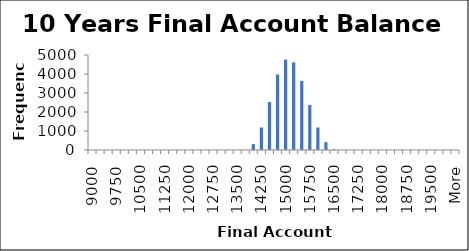
| Category | Frequency |
|---|---|
| 9000.0 | 0 |
| 9250.0 | 0 |
| 9500.0 | 0 |
| 9750.0 | 0 |
| 10000.0 | 0 |
| 10250.0 | 0 |
| 10500.0 | 0 |
| 10750.0 | 0 |
| 11000.0 | 0 |
| 11250.0 | 0 |
| 11500.0 | 0 |
| 11750.0 | 0 |
| 12000.0 | 0 |
| 12250.0 | 0 |
| 12500.0 | 0 |
| 12750.0 | 0 |
| 13000.0 | 0 |
| 13250.0 | 0 |
| 13500.0 | 0 |
| 13750.0 | 11 |
| 14000.0 | 309 |
| 14250.0 | 1181 |
| 14500.0 | 2523 |
| 14750.0 | 3973 |
| 15000.0 | 4757 |
| 15250.0 | 4614 |
| 15500.0 | 3634 |
| 15750.0 | 2365 |
| 16000.0 | 1186 |
| 16250.0 | 410 |
| 16500.0 | 37 |
| 16750.0 | 0 |
| 17000.0 | 0 |
| 17250.0 | 0 |
| 17500.0 | 0 |
| 17750.0 | 0 |
| 18000.0 | 0 |
| 18250.0 | 0 |
| 18500.0 | 0 |
| 18750.0 | 0 |
| 19000.0 | 0 |
| 19250.0 | 0 |
| 19500.0 | 0 |
| 19750.0 | 0 |
| 20000.0 | 0 |
| More | 0 |